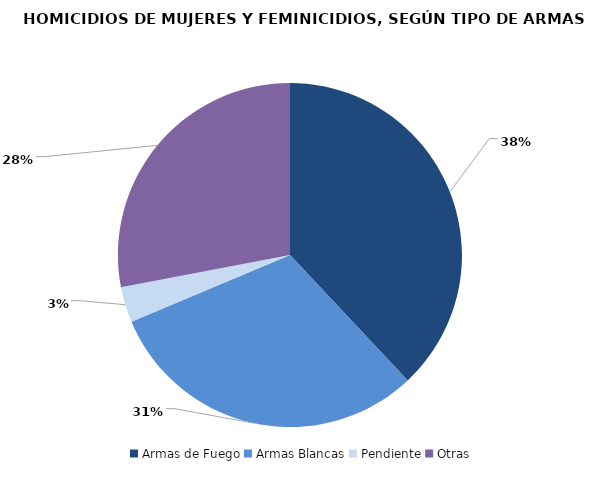
| Category | Series 0 |
|---|---|
| Armas de Fuego | 57 |
| Armas Blancas | 46 |
| Pendiente | 5 |
| Otras | 42 |